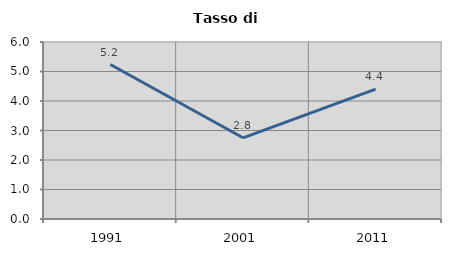
| Category | Tasso di disoccupazione   |
|---|---|
| 1991.0 | 5.236 |
| 2001.0 | 2.752 |
| 2011.0 | 4.405 |